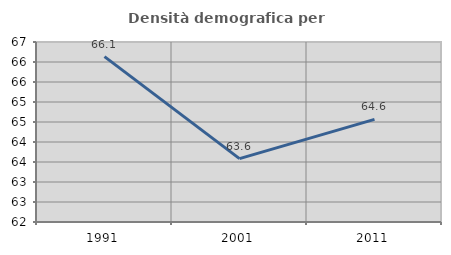
| Category | Densità demografica |
|---|---|
| 1991.0 | 66.135 |
| 2001.0 | 63.583 |
| 2011.0 | 64.565 |